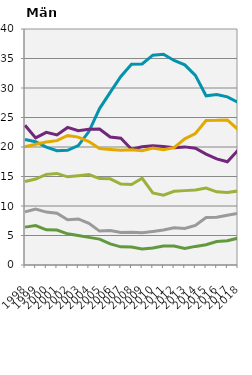
| Category |   -19 år |    20 år |    21 år |    22-25 år |    26-29 år |    30-34 år |
|---|---|---|---|---|---|---|
| 1998.0 | 21.264 | 23.676 | 14.14 | 20.037 | 8.996 | 6.417 |
| 1999.0 | 20.886 | 21.544 | 14.567 | 20.473 | 9.489 | 6.693 |
| 2000.0 | 19.967 | 22.474 | 15.363 | 20.833 | 8.969 | 5.965 |
| 2001.0 | 19.385 | 22.045 | 15.526 | 21.076 | 8.784 | 5.923 |
| 2002.0 | 19.441 | 23.321 | 14.942 | 21.956 | 7.679 | 5.279 |
| 2003.0 | 20.239 | 22.747 | 15.142 | 21.678 | 7.801 | 5.016 |
| 2004.0 | 22.612 | 22.989 | 15.34 | 20.925 | 7.058 | 4.686 |
| 2005.0 | 26.512 | 23.061 | 14.643 | 19.75 | 5.747 | 4.389 |
| 2006.0 | 29.259 | 21.695 | 14.612 | 19.591 | 5.844 | 3.568 |
| 2007.0 | 31.967 | 21.484 | 13.715 | 19.469 | 5.5 | 3.078 |
| 2008.0 | 34.022 | 19.625 | 13.651 | 19.531 | 5.57 | 3.064 |
| 2009.0 | 34.078 | 20.032 | 14.699 | 19.375 | 5.451 | 2.718 |
| 2010.0 | 35.57 | 20.203 | 12.208 | 19.836 | 5.671 | 2.878 |
| 2011.0 | 35.732 | 20.105 | 11.838 | 19.528 | 5.931 | 3.215 |
| 2012.0 | 34.661 | 19.872 | 12.491 | 19.907 | 6.311 | 3.213 |
| 2013.0 | 33.929 | 20.019 | 12.606 | 21.382 | 6.176 | 2.798 |
| 2014.0 | 32.132 | 19.797 | 12.714 | 22.279 | 6.704 | 3.153 |
| 2015.0 | 28.682 | 18.791 | 13.034 | 24.49 | 8.057 | 3.428 |
| 2016.0 | 28.911 | 17.992 | 12.399 | 24.518 | 8.108 | 3.977 |
| 2017.0 | 28.5 | 17.498 | 12.303 | 24.589 | 8.439 | 4.123 |
| 2018.0 | 27.568 | 19.463 | 12.543 | 22.959 | 8.748 | 4.559 |